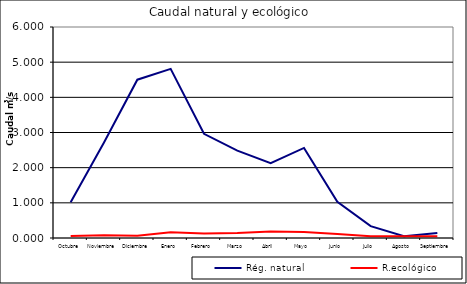
| Category | Rég. natural | R.ecológico |
|---|---|---|
| Octubre | 1.019 | 0.056 |
| Noviembre | 2.718 | 0.079 |
| Diciembre | 4.502 | 0.066 |
| Enero | 4.81 | 0.161 |
| Febrero | 2.962 | 0.131 |
| Marzo | 2.484 | 0.144 |
| Abril | 2.126 | 0.182 |
| Mayo | 2.562 | 0.172 |
| Junio | 1.031 | 0.114 |
| Julio | 0.337 | 0.053 |
| Agosto | 0.053 | 0.051 |
| Septiembre | 0.141 | 0.053 |